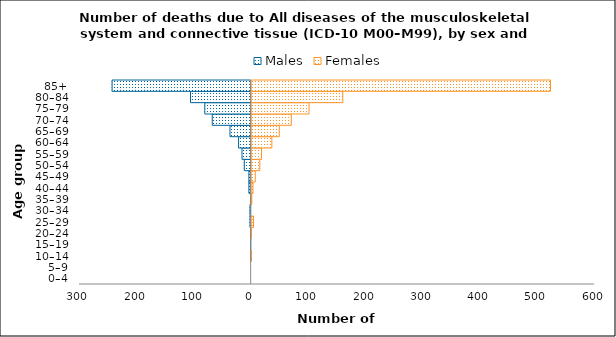
| Category | Males | Females |
|---|---|---|
| 0–4 | 0 | 0 |
| 5–9 | 0 | 0 |
| 10–14 | -1 | 1 |
| 15–19 | -1 | 0 |
| 20–24 | -1 | 1 |
| 25–29 | -2 | 5 |
| 30–34 | -2 | 0 |
| 35–39 | -1 | 2 |
| 40–44 | -4 | 4 |
| 45–49 | -4 | 8 |
| 50–54 | -12 | 16 |
| 55–59 | -16 | 19 |
| 60–64 | -22 | 37 |
| 65–69 | -37 | 50 |
| 70–74 | -68 | 71 |
| 75–79 | -81 | 102 |
| 80–84 | -106 | 161 |
| 85+ | -243 | 524 |